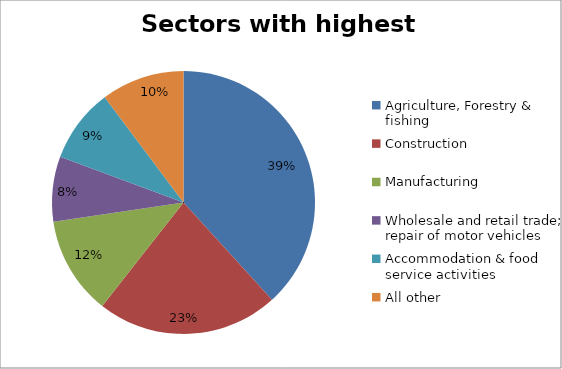
| Category | Sectors with highest totals | Percentage |
|---|---|---|
| Agriculture, Forestry & fishing | 101595 | 0.383 |
| Construction | 59331 | 0.223 |
| Manufacturing | 32043 | 0.121 |
| Wholesale and retail trade; repair of motor vehicles  | 21183 | 0.08 |
| Accommodation & food service activities | 24236 | 0.091 |
| All other | 27158 | 0.102 |